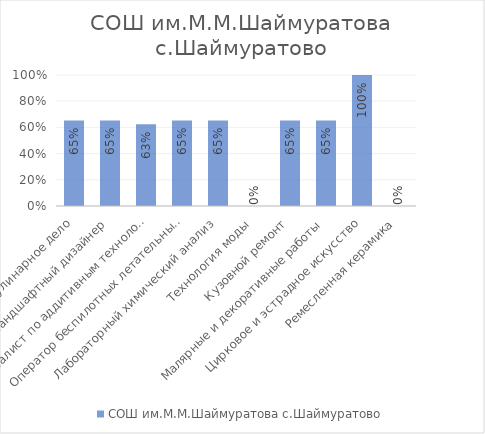
| Category | СОШ им.М.М.Шаймуратова с.Шаймуратово |
|---|---|
| Кулинарное дело | 0.653 |
| Ландшафтный дизайнер | 0.653 |
| Специалист по аддитивным технологиям | 0.625 |
| Оператор беспилотных летательных систем | 0.653 |
| Лабораторный химический анализ | 0.653 |
| Технология моды | 0 |
| Кузовной ремонт | 0.653 |
| Малярные и декоративные работы | 0.653 |
| Цирковое и эстрадное искусство | 1 |
| Ремесленная керамика | 0 |